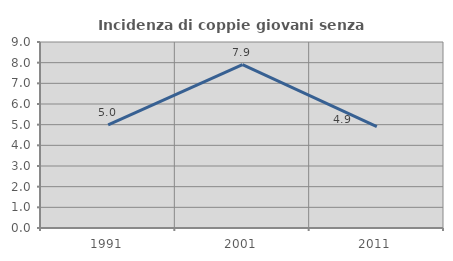
| Category | Incidenza di coppie giovani senza figli |
|---|---|
| 1991.0 | 4.988 |
| 2001.0 | 7.908 |
| 2011.0 | 4.909 |